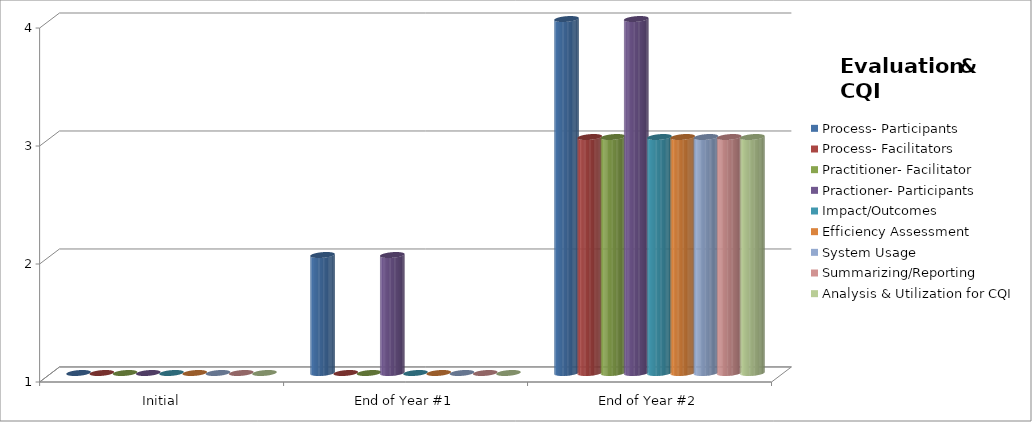
| Category | Process- Participants  | Process- Facilitators | Practitioner- Facilitator  | Practioner- Participants | Impact/Outcomes  | Efficiency Assessment  | System Usage  | Summarizing/Reporting | Analysis & Utilization for CQI |
|---|---|---|---|---|---|---|---|---|---|
| Initial | 1 | 1 | 1 | 1 | 1 | 1 | 1 | 1 | 1 |
| End of Year #1 | 2 | 1 | 1 | 2 | 1 | 1 | 1 | 1 | 1 |
| End of Year #2 | 4 | 3 | 3 | 4 | 3 | 3 | 3 | 3 | 3 |